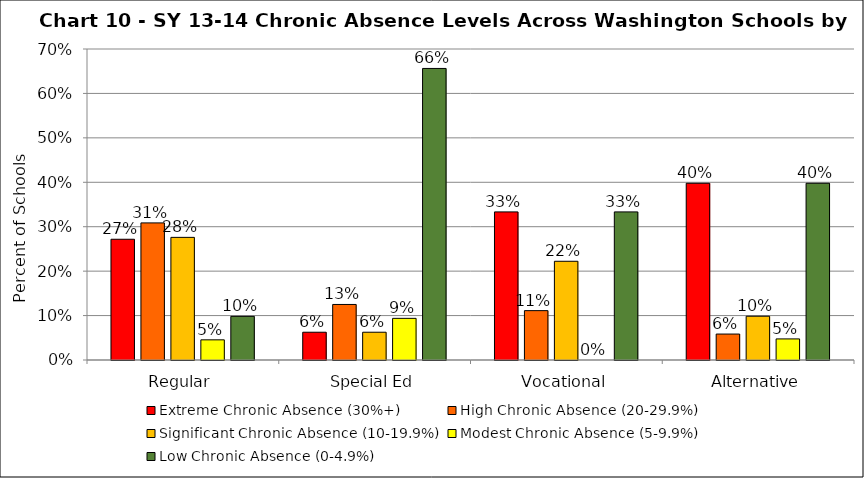
| Category | Extreme Chronic Absence (30%+) | High Chronic Absence (20-29.9%) | Significant Chronic Absence (10-19.9%) | Modest Chronic Absence (5-9.9%) | Low Chronic Absence (0-4.9%) |
|---|---|---|---|---|---|
| 0 | 0.272 | 0.309 | 0.276 | 0.045 | 0.098 |
| 1 | 0.062 | 0.125 | 0.062 | 0.094 | 0.656 |
| 2 | 0.333 | 0.111 | 0.222 | 0 | 0.333 |
| 3 | 0.398 | 0.058 | 0.099 | 0.047 | 0.398 |